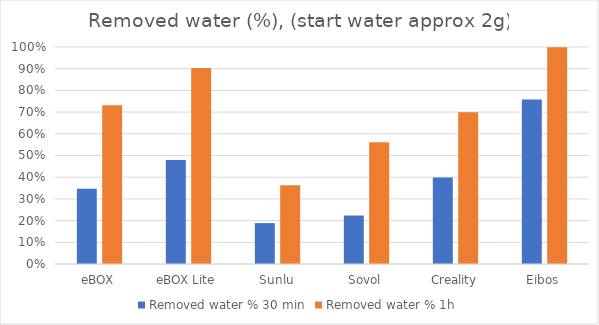
| Category | Removed water % 30 min | Removed water % 1h |
|---|---|---|
| eBOX | 0.347 | 0.732 |
| eBOX Lite | 0.48 | 0.903 |
| Sunlu | 0.188 | 0.363 |
| Sovol | 0.223 | 0.561 |
| Creality | 0.399 | 0.699 |
| Eibos | 0.758 | 0.999 |